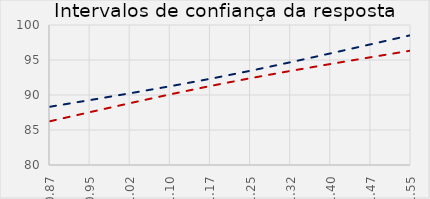
| Category | Series 0 | Series 2 |
|---|---|---|
| 0.87 | 88.324 | 86.251 |
| 0.9455555555555556 | 89.278 | 87.556 |
| 1.021111111111111 | 90.25 | 88.843 |
| 1.0966666666666667 | 91.255 | 90.096 |
| 1.1722222222222223 | 92.32 | 91.29 |
| 1.2477777777777779 | 93.465 | 92.404 |
| 1.3233333333333335 | 94.684 | 93.444 |
| 1.398888888888889 | 95.952 | 94.435 |
| 1.4744444444444447 | 97.247 | 95.398 |
| 1.55 | 98.556 | 96.348 |